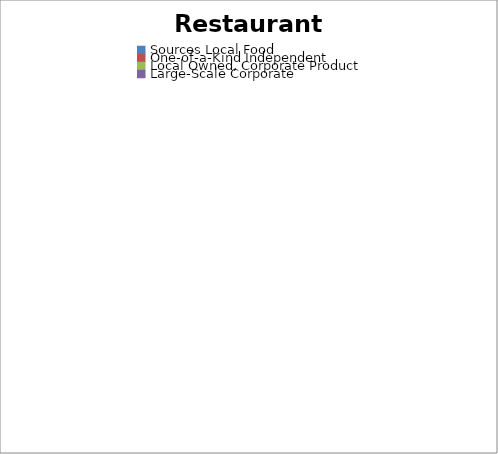
| Category | Series 0 |
|---|---|
| Sources Local Food | 0 |
| One-of-a-Kind Independent | 0 |
| Local Owned, Corporate Product | 0 |
| Large-Scale Corporate | 0 |